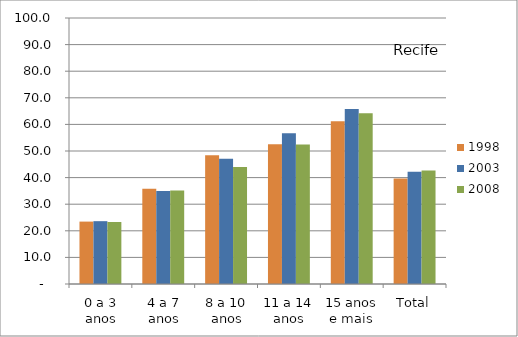
| Category | 1998 | 2003 | 2008 |
|---|---|---|---|
| 0 a 3 anos | 23.46 | 23.62 | 23.3 |
| 4 a 7 anos | 35.8 | 34.97 | 35.11 |
| 8 a 10 anos | 48.42 | 47.04 | 43.97 |
| 11 a 14 anos | 52.52 | 56.64 | 52.42 |
| 15 anos e mais | 61.14 | 65.78 | 64.18 |
| Total | 39.67 | 42.19 | 42.71 |